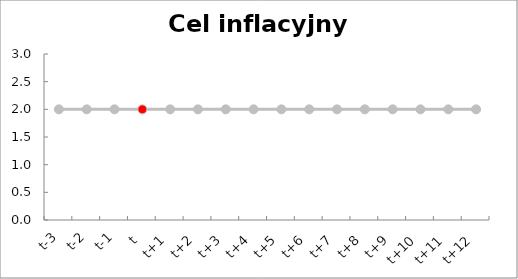
| Category | Series 1 | Cel inflacyjny π* |
|---|---|---|
| t-3 | 2 | 2 |
| t-2 | 2 | 2 |
| t-1 | 2 | 2 |
| t | 2 | 2 |
| t+1 | 2 | 2 |
| t+2 | 2 | 2 |
| t+3 | 2 | 2 |
| t+4 | 2 | 2 |
| t+5 | 2 | 2 |
| t+6 | 2 | 2 |
| t+7 | 2 | 2 |
| t+8 | 2 | 2 |
| t+9 | 2 | 2 |
| t+10 | 2 | 2 |
| t+11 | 2 | 2 |
| t+12 | 2 | 2 |